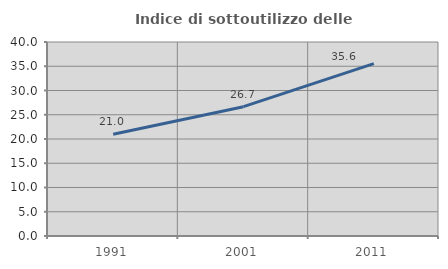
| Category | Indice di sottoutilizzo delle abitazioni  |
|---|---|
| 1991.0 | 20.988 |
| 2001.0 | 26.666 |
| 2011.0 | 35.556 |